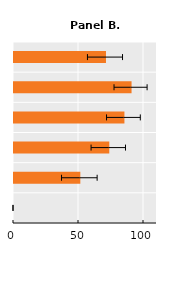
| Category | Series 0 |
|---|---|
| Nunca | 0 |
| 13 años o más | 51.022 |
| 10-12 | 73.296 |
| 7-9 | 84.945 |
| 4-6 | 90.432 |
| 3 años o menos | 70.759 |